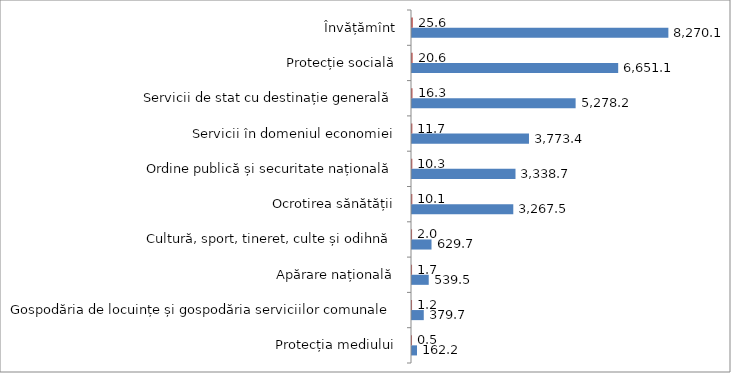
| Category | Series 0 | Series 1 |
|---|---|---|
| Protecția mediului | 162.2 | 0.502 |
| Gospodăria de locuințe și gospodăria serviciilor comunale | 379.7 | 1.176 |
| Apărare națională | 539.5 | 1.671 |
| Cultură, sport, tineret, culte și odihnă | 629.7 | 1.95 |
| Ocrotirea sănătății | 3267.5 | 10.119 |
| Ordine publică și securitate națională | 3338.7 | 10.34 |
| Servicii în domeniul economiei | 3773.4 | 11.686 |
| Servicii de stat cu destinație generală | 5278.2 | 16.346 |
| Protecție socială | 6651.1 | 20.598 |
| Învățămînt | 8270.1 | 25.612 |